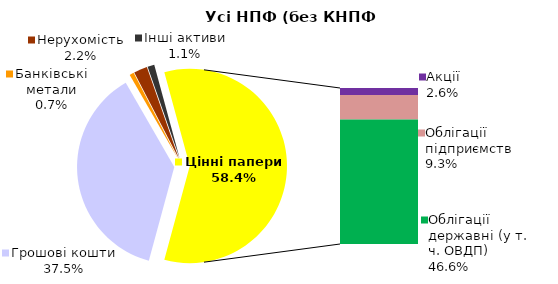
| Category | Усі НПФ (без КНПФ НБУ) |
|---|---|
| Грошові кошти | 473.767 |
| Банківські метали | 9.132 |
| Нерухомість | 28.393 |
| Інші активи | 14.359 |
| Акції | 32.603 |
| Облігації підприємств | 117.083 |
| Муніципальні облігації | 0 |
| Облігації державні (у т. ч. ОВДП) | 589.268 |